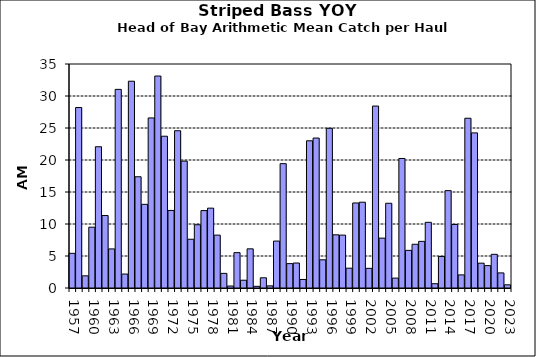
| Category | Series 0 |
|---|---|
| 1957.0 | 5.417 |
| 1958.0 | 28.2 |
| 1959.0 | 1.9 |
| 1960.0 | 9.5 |
| 1961.0 | 22.071 |
| 1962.0 | 11.321 |
| 1963.0 | 6.107 |
| 1964.0 | 31.036 |
| 1965.0 | 2.179 |
| 1966.0 | 32.31 |
| 1967.0 | 17.381 |
| 1968.0 | 13.071 |
| 1969.0 | 26.571 |
| 1970.0 | 33.119 |
| 1971.0 | 23.714 |
| 1972.0 | 12.119 |
| 1973.0 | 24.571 |
| 1974.0 | 19.825 |
| 1975.0 | 7.619 |
| 1976.0 | 9.881 |
| 1977.0 | 12.095 |
| 1978.0 | 12.476 |
| 1979.0 | 8.262 |
| 1980.0 | 2.286 |
| 1981.0 | 0.31 |
| 1982.0 | 5.524 |
| 1983.0 | 1.214 |
| 1984.0 | 6.119 |
| 1985.0 | 0.262 |
| 1986.0 | 1.595 |
| 1987.0 | 0.333 |
| 1988.0 | 7.333 |
| 1989.0 | 19.429 |
| 1990.0 | 3.81 |
| 1991.0 | 3.905 |
| 1992.0 | 1.333 |
| 1993.0 | 23 |
| 1994.0 | 23.429 |
| 1995.0 | 4.405 |
| 1996.0 | 24.952 |
| 1997.0 | 8.31 |
| 1998.0 | 8.262 |
| 1999.0 | 3.095 |
| 2000.0 | 13.286 |
| 2001.0 | 13.405 |
| 2002.0 | 3.071 |
| 2003.0 | 28.429 |
| 2004.0 | 7.79 |
| 2005.0 | 13.238 |
| 2006.0 | 1.548 |
| 2007.0 | 20.238 |
| 2008.0 | 5.881 |
| 2009.0 | 6.833 |
| 2010.0 | 7.286 |
| 2011.0 | 10.262 |
| 2012.0 | 0.667 |
| 2013.0 | 4.929 |
| 2014.0 | 15.214 |
| 2015.0 | 9.929 |
| 2016.0 | 2.048 |
| 2017.0 | 26.524 |
| 2018.0 | 24.238 |
| 2019.0 | 3.881 |
| 2020.0 | 3.5 |
| 2021.0 | 5.262 |
| 2022.0 | 2.357 |
| 2023.0 | 0.5 |